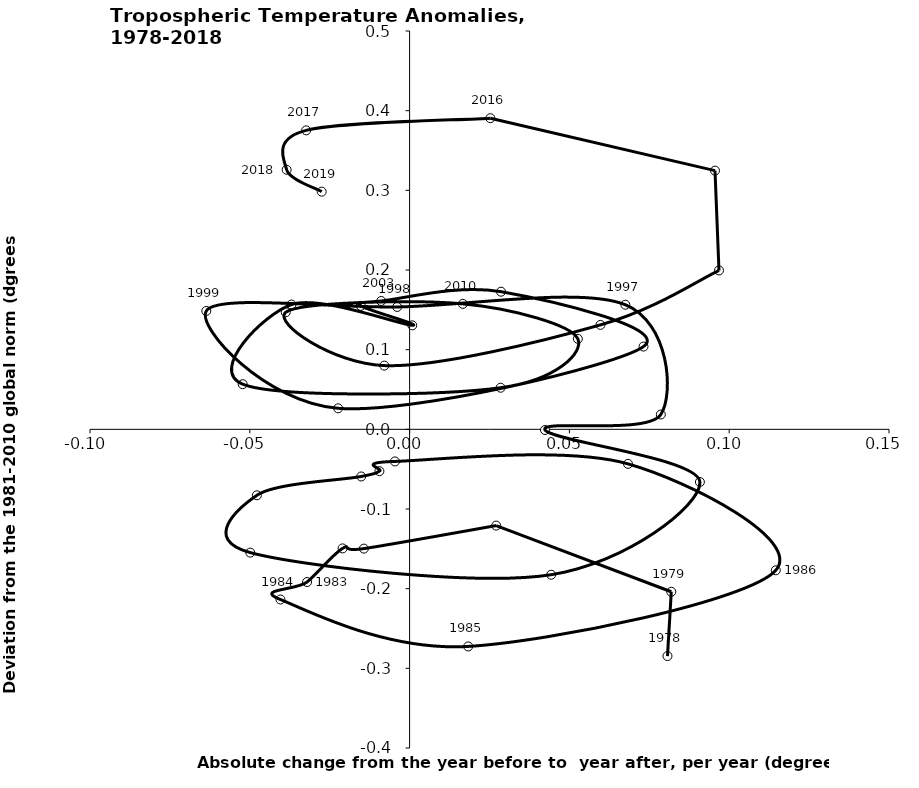
| Category | Series 0 |
|---|---|
| 0.08069444444444443 | -0.285 |
| 0.08187499999999998 | -0.204 |
| 0.02708333333333332 | -0.121 |
| -0.014305555555555564 | -0.15 |
| -0.02097222222222221 | -0.149 |
| -0.03208333333333331 | -0.192 |
| -0.040416666666666656 | -0.214 |
| 0.018333333333333326 | -0.272 |
| 0.11458333333333331 | -0.177 |
| 0.06833333333333332 | -0.043 |
| -0.004583333333333342 | -0.04 |
| -0.00944444444444444 | -0.053 |
| -0.015138888888888893 | -0.059 |
| -0.047777777777777794 | -0.083 |
| -0.04986111111111111 | -0.155 |
| 0.04430555555555557 | -0.183 |
| 0.09083333333333335 | -0.066 |
| 0.04236111111111111 | -0.001 |
| 0.07861111111111112 | 0.019 |
| 0.06750000000000002 | 0.156 |
| -0.0038888888888888723 | 0.154 |
| -0.06361111111111113 | 0.149 |
| -0.022361111111111144 | 0.026 |
| 0.07319444444444445 | 0.104 |
| 0.028611111111111122 | 0.173 |
| -0.008888888888888877 | 0.161 |
| -0.015277777777777779 | 0.155 |
| 0.0008333333333333248 | 0.131 |
| -0.036944444444444446 | 0.157 |
| -0.052222222222222225 | 0.057 |
| 0.028472222222222215 | 0.052 |
| 0.05263888888888889 | 0.114 |
| 0.01666666666666667 | 0.158 |
| -0.03875 | 0.147 |
| -0.007916666666666669 | 0.08 |
| 0.05972222222222221 | 0.131 |
| 0.09680555555555558 | 0.199 |
| 0.09555555555555559 | 0.325 |
| 0.025277777777777788 | 0.391 |
| -0.03236111111111112 | 0.375 |
| -0.03847222222222224 | 0.326 |
| -0.027500000000000024 | 0.298 |